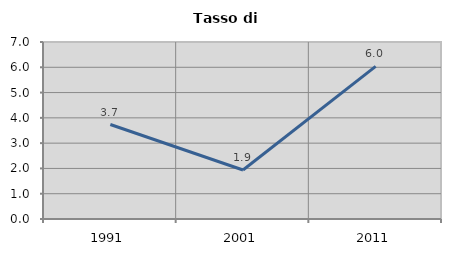
| Category | Tasso di disoccupazione   |
|---|---|
| 1991.0 | 3.736 |
| 2001.0 | 1.938 |
| 2011.0 | 6.038 |